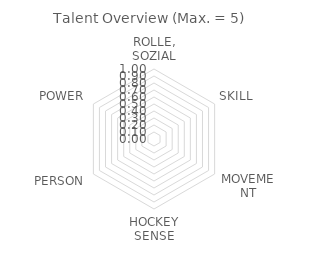
| Category | Series 2 |
|---|---|
| ROLLE, SOZIAL | 0 |
| SKILL | 0 |
| MOVEMENT | 0 |
| HOCKEY SENSE | 0 |
| PERSON | 0 |
| POWER | 0 |